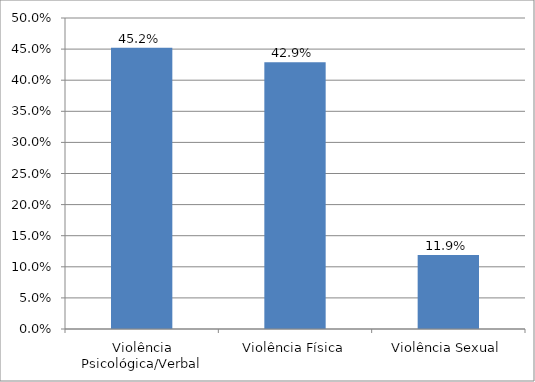
| Category | Series 0 |
|---|---|
| Violência Psicológica/Verbal | 0.452 |
| Violência Física | 0.429 |
| Violência Sexual | 0.119 |